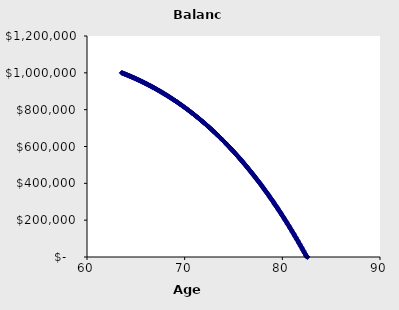
| Category | Balance |
|---|---|
| 63.56438356164384 | 1000000 |
| 63.64771689497717 | 998267.77 |
| 63.73105022831051 | 996519.22 |
| 63.814383561643844 | 994754.26 |
| 63.89771689497718 | 992972.82 |
| 63.981050228310515 | 991174.82 |
| 64.06438356164385 | 989360.19 |
| 64.14771689497718 | 987528.85 |
| 64.23105022831051 | 985680.71 |
| 64.31438356164384 | 983815.7 |
| 64.39771689497717 | 981933.75 |
| 64.4810502283105 | 980034.77 |
| 64.56438356164382 | 978118.68 |
| 64.64771689497715 | 976185.41 |
| 64.73105022831048 | 974234.87 |
| 64.81438356164381 | 972266.99 |
| 64.89771689497714 | 970281.68 |
| 64.98105022831047 | 968278.86 |
| 65.0643835616438 | 966258.46 |
| 65.14771689497712 | 964220.39 |
| 65.23105022831045 | 962164.57 |
| 65.31438356164378 | 960090.92 |
| 65.39771689497711 | 957999.35 |
| 65.48105022831044 | 955889.79 |
| 65.56438356164377 | 953762.15 |
| 65.6477168949771 | 951616.35 |
| 65.73105022831042 | 949452.3 |
| 65.81438356164375 | 947269.92 |
| 65.89771689497708 | 945069.13 |
| 65.98105022831041 | 942849.84 |
| 66.06438356164374 | 940611.96 |
| 66.14771689497707 | 938355.41 |
| 66.2310502283104 | 936080.11 |
| 66.31438356164372 | 933785.97 |
| 66.39771689497705 | 931472.9 |
| 66.48105022831038 | 929140.82 |
| 66.56438356164371 | 926789.64 |
| 66.64771689497704 | 924419.27 |
| 66.73105022831037 | 922029.63 |
| 66.8143835616437 | 919620.62 |
| 66.89771689497702 | 917192.16 |
| 66.98105022831035 | 914744.16 |
| 67.06438356164368 | 912276.53 |
| 67.14771689497701 | 909789.18 |
| 67.23105022831034 | 907282.02 |
| 67.31438356164367 | 904754.96 |
| 67.397716894977 | 902207.91 |
| 67.48105022831032 | 899640.78 |
| 67.56438356164365 | 897053.48 |
| 67.64771689497698 | 894445.92 |
| 67.73105022831031 | 891818.01 |
| 67.81438356164364 | 889169.65 |
| 67.89771689497697 | 886500.75 |
| 67.9810502283103 | 883811.21 |
| 68.06438356164362 | 881100.95 |
| 68.14771689497695 | 878369.87 |
| 68.23105022831028 | 875617.88 |
| 68.31438356164361 | 872844.89 |
| 68.39771689497694 | 870050.79 |
| 68.48105022831027 | 867235.5 |
| 68.5643835616436 | 864398.92 |
| 68.64771689497692 | 861540.95 |
| 68.73105022831025 | 858661.49 |
| 68.81438356164358 | 855760.45 |
| 68.89771689497691 | 852837.73 |
| 68.98105022831024 | 849893.24 |
| 69.06438356164357 | 846926.88 |
| 69.1477168949769 | 843938.55 |
| 69.23105022831022 | 840928.15 |
| 69.31438356164355 | 837895.58 |
| 69.39771689497688 | 834840.75 |
| 69.48105022831021 | 831763.55 |
| 69.56438356164354 | 828663.89 |
| 69.64771689497687 | 825541.66 |
| 69.7310502283102 | 822396.77 |
| 69.81438356164352 | 819229.11 |
| 69.89771689497685 | 816038.58 |
| 69.98105022831018 | 812825.08 |
| 70.06438356164351 | 809588.51 |
| 70.14771689497684 | 806328.76 |
| 70.23105022831017 | 803045.73 |
| 70.3143835616435 | 799739.32 |
| 70.39771689497682 | 796409.42 |
| 70.48105022831015 | 793055.93 |
| 70.56438356164348 | 789678.74 |
| 70.64771689497681 | 786277.75 |
| 70.73105022831014 | 782852.86 |
| 70.81438356164347 | 779403.95 |
| 70.8977168949768 | 775930.92 |
| 70.98105022831012 | 772433.67 |
| 71.06438356164345 | 768912.09 |
| 71.14771689497678 | 765366.07 |
| 71.23105022831011 | 761795.5 |
| 71.31438356164344 | 758200.28 |
| 71.39771689497677 | 754580.29 |
| 71.4810502283101 | 750935.43 |
| 71.56438356164342 | 747265.59 |
| 71.64771689497675 | 743570.66 |
| 71.73105022831008 | 739850.52 |
| 71.81438356164341 | 736105.07 |
| 71.89771689497674 | 732334.19 |
| 71.98105022831007 | 728537.77 |
| 72.0643835616434 | 724715.71 |
| 72.14771689497672 | 720867.89 |
| 72.23105022831005 | 716994.19 |
| 72.31438356164338 | 713094.5 |
| 72.39771689497671 | 709168.71 |
| 72.48105022831004 | 705216.71 |
| 72.56438356164337 | 701238.37 |
| 72.6477168949767 | 697233.58 |
| 72.73105022831002 | 693202.23 |
| 72.81438356164335 | 689144.2 |
| 72.89771689497668 | 685059.38 |
| 72.98105022831001 | 680947.64 |
| 73.06438356164334 | 676808.88 |
| 73.14771689497667 | 672642.97 |
| 73.23105022831 | 668449.79 |
| 73.31438356164333 | 664229.23 |
| 73.39771689497665 | 659981.17 |
| 73.48105022830998 | 655705.49 |
| 73.56438356164331 | 651402.06 |
| 73.64771689497664 | 647070.77 |
| 73.73105022830997 | 642711.49 |
| 73.8143835616433 | 638324.1 |
| 73.89771689497663 | 633908.49 |
| 73.98105022830995 | 629464.53 |
| 74.06438356164328 | 624992.1 |
| 74.14771689497661 | 620491.07 |
| 74.23105022830994 | 615961.31 |
| 74.31438356164327 | 611402.7 |
| 74.3977168949766 | 606815.13 |
| 74.48105022830993 | 602198.47 |
| 74.56438356164325 | 597552.59 |
| 74.64771689497658 | 592877.36 |
| 74.73105022830991 | 588172.66 |
| 74.81438356164324 | 583438.36 |
| 74.89771689497657 | 578674.32 |
| 74.9810502283099 | 573880.42 |
| 75.06438356164323 | 569056.53 |
| 75.14771689497655 | 564202.53 |
| 75.23105022830988 | 559318.29 |
| 75.31438356164321 | 554403.67 |
| 75.39771689497654 | 549458.55 |
| 75.48105022830987 | 544482.8 |
| 75.5643835616432 | 539476.28 |
| 75.64771689497653 | 534438.86 |
| 75.73105022830985 | 529370.41 |
| 75.81438356164318 | 524270.8 |
| 75.89771689497651 | 519139.89 |
| 75.98105022830984 | 513977.55 |
| 76.06438356164317 | 508783.64 |
| 76.1477168949765 | 503558.03 |
| 76.23105022830983 | 498300.58 |
| 76.31438356164315 | 493011.15 |
| 76.39771689497648 | 487689.61 |
| 76.48105022830981 | 482335.82 |
| 76.56438356164314 | 476949.65 |
| 76.64771689497647 | 471530.95 |
| 76.7310502283098 | 466079.59 |
| 76.81438356164313 | 460595.43 |
| 76.89771689497645 | 455078.33 |
| 76.98105022830978 | 449528.15 |
| 77.06438356164311 | 443944.75 |
| 77.14771689497644 | 438327.99 |
| 77.23105022830977 | 432677.72 |
| 77.3143835616431 | 426993.8 |
| 77.39771689497643 | 421276.08 |
| 77.48105022830975 | 415524.42 |
| 77.56438356164308 | 409738.68 |
| 77.64771689497641 | 403918.72 |
| 77.73105022830974 | 398064.39 |
| 77.81438356164307 | 392175.54 |
| 77.8977168949764 | 386252.03 |
| 77.98105022830973 | 380293.72 |
| 78.06438356164306 | 374300.45 |
| 78.14771689497638 | 368272.07 |
| 78.23105022830971 | 362208.43 |
| 78.31438356164304 | 356109.39 |
| 78.39771689497637 | 349974.8 |
| 78.4810502283097 | 343804.51 |
| 78.56438356164303 | 337598.37 |
| 78.64771689497636 | 331356.22 |
| 78.73105022830968 | 325077.91 |
| 78.81438356164301 | 318763.29 |
| 78.89771689497634 | 312412.21 |
| 78.98105022830967 | 306024.51 |
| 79.064383561643 | 299600.04 |
| 79.14771689497633 | 293138.65 |
| 79.23105022830966 | 286640.18 |
| 79.31438356164298 | 280104.48 |
| 79.39771689497631 | 273531.38 |
| 79.48105022830964 | 266920.73 |
| 79.56438356164297 | 260272.38 |
| 79.6477168949763 | 253586.16 |
| 79.73105022830963 | 246861.92 |
| 79.81438356164296 | 240099.49 |
| 79.89771689497628 | 233298.72 |
| 79.98105022830961 | 226459.44 |
| 80.06438356164294 | 219581.49 |
| 80.14771689497627 | 212664.72 |
| 80.2310502283096 | 205708.96 |
| 80.31438356164293 | 198714.05 |
| 80.39771689497626 | 191679.82 |
| 80.48105022830958 | 184606.11 |
| 80.56438356164291 | 177492.75 |
| 80.64771689497624 | 170339.58 |
| 80.73105022830957 | 163146.43 |
| 80.8143835616429 | 155913.13 |
| 80.89771689497623 | 148639.52 |
| 80.98105022830956 | 141325.43 |
| 81.06438356164288 | 133970.68 |
| 81.14771689497621 | 126575.12 |
| 81.23105022830954 | 119138.57 |
| 81.31438356164287 | 111660.86 |
| 81.3977168949762 | 104141.81 |
| 81.48105022830953 | 96581.26 |
| 81.56438356164286 | 88979.04 |
| 81.64771689497618 | 81334.97 |
| 81.73105022830951 | 73648.88 |
| 81.81438356164284 | 65920.59 |
| 81.89771689497617 | 58149.93 |
| 81.9810502283095 | 50336.71 |
| 82.06438356164283 | 42480.77 |
| 82.14771689497616 | 34581.92 |
| 82.23105022830948 | 26639.99 |
| 82.31438356164281 | 18654.8 |
| 82.39771689497614 | 10626.17 |
| 82.48105022830947 | 2553.92 |
| 82.5643835616428 | 0 |
| #N/A | 0 |
| #N/A | 0 |
| #N/A | 0 |
| #N/A | 0 |
| #N/A | 0 |
| #N/A | 0 |
| #N/A | 0 |
| #N/A | 0 |
| #N/A | 0 |
| #N/A | 0 |
| #N/A | 0 |
| #N/A | 0 |
| #N/A | 0 |
| #N/A | 0 |
| #N/A | 0 |
| #N/A | 0 |
| #N/A | 0 |
| #N/A | 0 |
| #N/A | 0 |
| #N/A | 0 |
| #N/A | 0 |
| #N/A | 0 |
| #N/A | 0 |
| #N/A | 0 |
| #N/A | 0 |
| #N/A | 0 |
| #N/A | 0 |
| #N/A | 0 |
| #N/A | 0 |
| #N/A | 0 |
| #N/A | 0 |
| #N/A | 0 |
| #N/A | 0 |
| #N/A | 0 |
| #N/A | 0 |
| #N/A | 0 |
| #N/A | 0 |
| #N/A | 0 |
| #N/A | 0 |
| #N/A | 0 |
| #N/A | 0 |
| #N/A | 0 |
| #N/A | 0 |
| #N/A | 0 |
| #N/A | 0 |
| #N/A | 0 |
| #N/A | 0 |
| #N/A | 0 |
| #N/A | 0 |
| #N/A | 0 |
| #N/A | 0 |
| #N/A | 0 |
| #N/A | 0 |
| #N/A | 0 |
| #N/A | 0 |
| #N/A | 0 |
| #N/A | 0 |
| #N/A | 0 |
| #N/A | 0 |
| #N/A | 0 |
| #N/A | 0 |
| #N/A | 0 |
| #N/A | 0 |
| #N/A | 0 |
| #N/A | 0 |
| #N/A | 0 |
| #N/A | 0 |
| #N/A | 0 |
| #N/A | 0 |
| #N/A | 0 |
| #N/A | 0 |
| #N/A | 0 |
| #N/A | 0 |
| #N/A | 0 |
| #N/A | 0 |
| #N/A | 0 |
| #N/A | 0 |
| #N/A | 0 |
| #N/A | 0 |
| #N/A | 0 |
| #N/A | 0 |
| #N/A | 0 |
| #N/A | 0 |
| #N/A | 0 |
| #N/A | 0 |
| #N/A | 0 |
| #N/A | 0 |
| #N/A | 0 |
| #N/A | 0 |
| #N/A | 0 |
| #N/A | 0 |
| #N/A | 0 |
| #N/A | 0 |
| #N/A | 0 |
| #N/A | 0 |
| #N/A | 0 |
| #N/A | 0 |
| #N/A | 0 |
| #N/A | 0 |
| #N/A | 0 |
| #N/A | 0 |
| #N/A | 0 |
| #N/A | 0 |
| #N/A | 0 |
| #N/A | 0 |
| #N/A | 0 |
| #N/A | 0 |
| #N/A | 0 |
| #N/A | 0 |
| #N/A | 0 |
| #N/A | 0 |
| #N/A | 0 |
| #N/A | 0 |
| #N/A | 0 |
| #N/A | 0 |
| #N/A | 0 |
| #N/A | 0 |
| #N/A | 0 |
| #N/A | 0 |
| #N/A | 0 |
| #N/A | 0 |
| #N/A | 0 |
| #N/A | 0 |
| #N/A | 0 |
| #N/A | 0 |
| #N/A | 0 |
| #N/A | 0 |
| #N/A | 0 |
| #N/A | 0 |
| #N/A | 0 |
| #N/A | 0 |
| #N/A | 0 |
| #N/A | 0 |
| #N/A | 0 |
| #N/A | 0 |
| #N/A | 0 |
| #N/A | 0 |
| #N/A | 0 |
| #N/A | 0 |
| #N/A | 0 |
| #N/A | 0 |
| #N/A | 0 |
| #N/A | 0 |
| #N/A | 0 |
| #N/A | 0 |
| #N/A | 0 |
| #N/A | 0 |
| #N/A | 0 |
| #N/A | 0 |
| #N/A | 0 |
| #N/A | 0 |
| #N/A | 0 |
| #N/A | 0 |
| #N/A | 0 |
| #N/A | 0 |
| #N/A | 0 |
| #N/A | 0 |
| #N/A | 0 |
| #N/A | 0 |
| #N/A | 0 |
| #N/A | 0 |
| #N/A | 0 |
| #N/A | 0 |
| #N/A | 0 |
| #N/A | 0 |
| #N/A | 0 |
| #N/A | 0 |
| #N/A | 0 |
| #N/A | 0 |
| #N/A | 0 |
| #N/A | 0 |
| #N/A | 0 |
| #N/A | 0 |
| #N/A | 0 |
| #N/A | 0 |
| #N/A | 0 |
| #N/A | 0 |
| #N/A | 0 |
| #N/A | 0 |
| #N/A | 0 |
| #N/A | 0 |
| #N/A | 0 |
| #N/A | 0 |
| #N/A | 0 |
| #N/A | 0 |
| #N/A | 0 |
| #N/A | 0 |
| #N/A | 0 |
| #N/A | 0 |
| #N/A | 0 |
| #N/A | 0 |
| #N/A | 0 |
| #N/A | 0 |
| #N/A | 0 |
| #N/A | 0 |
| #N/A | 0 |
| #N/A | 0 |
| #N/A | 0 |
| #N/A | 0 |
| #N/A | 0 |
| #N/A | 0 |
| #N/A | 0 |
| #N/A | 0 |
| #N/A | 0 |
| #N/A | 0 |
| #N/A | 0 |
| #N/A | 0 |
| #N/A | 0 |
| #N/A | 0 |
| #N/A | 0 |
| #N/A | 0 |
| #N/A | 0 |
| #N/A | 0 |
| #N/A | 0 |
| #N/A | 0 |
| #N/A | 0 |
| #N/A | 0 |
| #N/A | 0 |
| #N/A | 0 |
| #N/A | 0 |
| #N/A | 0 |
| #N/A | 0 |
| #N/A | 0 |
| #N/A | 0 |
| #N/A | 0 |
| #N/A | 0 |
| #N/A | 0 |
| #N/A | 0 |
| #N/A | 0 |
| #N/A | 0 |
| #N/A | 0 |
| #N/A | 0 |
| #N/A | 0 |
| #N/A | 0 |
| #N/A | 0 |
| #N/A | 0 |
| #N/A | 0 |
| #N/A | 0 |
| #N/A | 0 |
| #N/A | 0 |
| #N/A | 0 |
| #N/A | 0 |
| #N/A | 0 |
| #N/A | 0 |
| #N/A | 0 |
| #N/A | 0 |
| #N/A | 0 |
| #N/A | 0 |
| #N/A | 0 |
| #N/A | 0 |
| #N/A | 0 |
| #N/A | 0 |
| #N/A | 0 |
| #N/A | 0 |
| #N/A | 0 |
| #N/A | 0 |
| #N/A | 0 |
| #N/A | 0 |
| #N/A | 0 |
| #N/A | 0 |
| #N/A | 0 |
| #N/A | 0 |
| #N/A | 0 |
| #N/A | 0 |
| #N/A | 0 |
| #N/A | 0 |
| #N/A | 0 |
| #N/A | 0 |
| #N/A | 0 |
| #N/A | 0 |
| #N/A | 0 |
| #N/A | 0 |
| #N/A | 0 |
| #N/A | 0 |
| #N/A | 0 |
| #N/A | 0 |
| #N/A | 0 |
| #N/A | 0 |
| #N/A | 0 |
| #N/A | 0 |
| #N/A | 0 |
| #N/A | 0 |
| #N/A | 0 |
| #N/A | 0 |
| #N/A | 0 |
| #N/A | 0 |
| #N/A | 0 |
| #N/A | 0 |
| #N/A | 0 |
| #N/A | 0 |
| #N/A | 0 |
| #N/A | 0 |
| #N/A | 0 |
| #N/A | 0 |
| #N/A | 0 |
| #N/A | 0 |
| #N/A | 0 |
| #N/A | 0 |
| #N/A | 0 |
| #N/A | 0 |
| #N/A | 0 |
| #N/A | 0 |
| #N/A | 0 |
| #N/A | 0 |
| #N/A | 0 |
| #N/A | 0 |
| #N/A | 0 |
| #N/A | 0 |
| #N/A | 0 |
| #N/A | 0 |
| #N/A | 0 |
| #N/A | 0 |
| #N/A | 0 |
| #N/A | 0 |
| #N/A | 0 |
| #N/A | 0 |
| #N/A | 0 |
| #N/A | 0 |
| #N/A | 0 |
| #N/A | 0 |
| #N/A | 0 |
| #N/A | 0 |
| #N/A | 0 |
| #N/A | 0 |
| #N/A | 0 |
| #N/A | 0 |
| #N/A | 0 |
| #N/A | 0 |
| #N/A | 0 |
| #N/A | 0 |
| #N/A | 0 |
| #N/A | 0 |
| #N/A | 0 |
| #N/A | 0 |
| #N/A | 0 |
| #N/A | 0 |
| #N/A | 0 |
| #N/A | 0 |
| #N/A | 0 |
| #N/A | 0 |
| #N/A | 0 |
| #N/A | 0 |
| #N/A | 0 |
| #N/A | 0 |
| #N/A | 0 |
| #N/A | 0 |
| #N/A | 0 |
| #N/A | 0 |
| #N/A | 0 |
| #N/A | 0 |
| #N/A | 0 |
| #N/A | 0 |
| #N/A | 0 |
| #N/A | 0 |
| #N/A | 0 |
| #N/A | 0 |
| #N/A | 0 |
| #N/A | 0 |
| #N/A | 0 |
| #N/A | 0 |
| #N/A | 0 |
| #N/A | 0 |
| #N/A | 0 |
| #N/A | 0 |
| #N/A | 0 |
| #N/A | 0 |
| #N/A | 0 |
| #N/A | 0 |
| #N/A | 0 |
| #N/A | 0 |
| #N/A | 0 |
| #N/A | 0 |
| #N/A | 0 |
| #N/A | 0 |
| #N/A | 0 |
| #N/A | 0 |
| #N/A | 0 |
| #N/A | 0 |
| #N/A | 0 |
| #N/A | 0 |
| #N/A | 0 |
| #N/A | 0 |
| #N/A | 0 |
| #N/A | 0 |
| #N/A | 0 |
| #N/A | 0 |
| #N/A | 0 |
| #N/A | 0 |
| #N/A | 0 |
| #N/A | 0 |
| #N/A | 0 |
| #N/A | 0 |
| #N/A | 0 |
| #N/A | 0 |
| #N/A | 0 |
| #N/A | 0 |
| #N/A | 0 |
| #N/A | 0 |
| #N/A | 0 |
| #N/A | 0 |
| #N/A | 0 |
| #N/A | 0 |
| #N/A | 0 |
| #N/A | 0 |
| #N/A | 0 |
| #N/A | 0 |
| #N/A | 0 |
| #N/A | 0 |
| #N/A | 0 |
| #N/A | 0 |
| #N/A | 0 |
| #N/A | 0 |
| #N/A | 0 |
| #N/A | 0 |
| #N/A | 0 |
| #N/A | 0 |
| #N/A | 0 |
| #N/A | 0 |
| #N/A | 0 |
| #N/A | 0 |
| #N/A | 0 |
| #N/A | 0 |
| #N/A | 0 |
| #N/A | 0 |
| #N/A | 0 |
| #N/A | 0 |
| #N/A | 0 |
| #N/A | 0 |
| #N/A | 0 |
| #N/A | 0 |
| #N/A | 0 |
| #N/A | 0 |
| #N/A | 0 |
| #N/A | 0 |
| #N/A | 0 |
| #N/A | 0 |
| #N/A | 0 |
| #N/A | 0 |
| #N/A | 0 |
| #N/A | 0 |
| #N/A | 0 |
| #N/A | 0 |
| #N/A | 0 |
| #N/A | 0 |
| #N/A | 0 |
| #N/A | 0 |
| #N/A | 0 |
| #N/A | 0 |
| #N/A | 0 |
| #N/A | 0 |
| #N/A | 0 |
| #N/A | 0 |
| #N/A | 0 |
| #N/A | 0 |
| #N/A | 0 |
| #N/A | 0 |
| #N/A | 0 |
| #N/A | 0 |
| #N/A | 0 |
| #N/A | 0 |
| #N/A | 0 |
| #N/A | 0 |
| #N/A | 0 |
| #N/A | 0 |
| #N/A | 0 |
| #N/A | 0 |
| #N/A | 0 |
| #N/A | 0 |
| #N/A | 0 |
| #N/A | 0 |
| #N/A | 0 |
| #N/A | 0 |
| #N/A | 0 |
| #N/A | 0 |
| #N/A | 0 |
| #N/A | 0 |
| #N/A | 0 |
| #N/A | 0 |
| #N/A | 0 |
| #N/A | 0 |
| #N/A | 0 |
| #N/A | 0 |
| #N/A | 0 |
| #N/A | 0 |
| #N/A | 0 |
| #N/A | 0 |
| #N/A | 0 |
| #N/A | 0 |
| #N/A | 0 |
| #N/A | 0 |
| #N/A | 0 |
| #N/A | 0 |